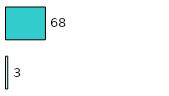
| Category | Series 0 | Series 1 |
|---|---|---|
| 0 | 3 | 68 |